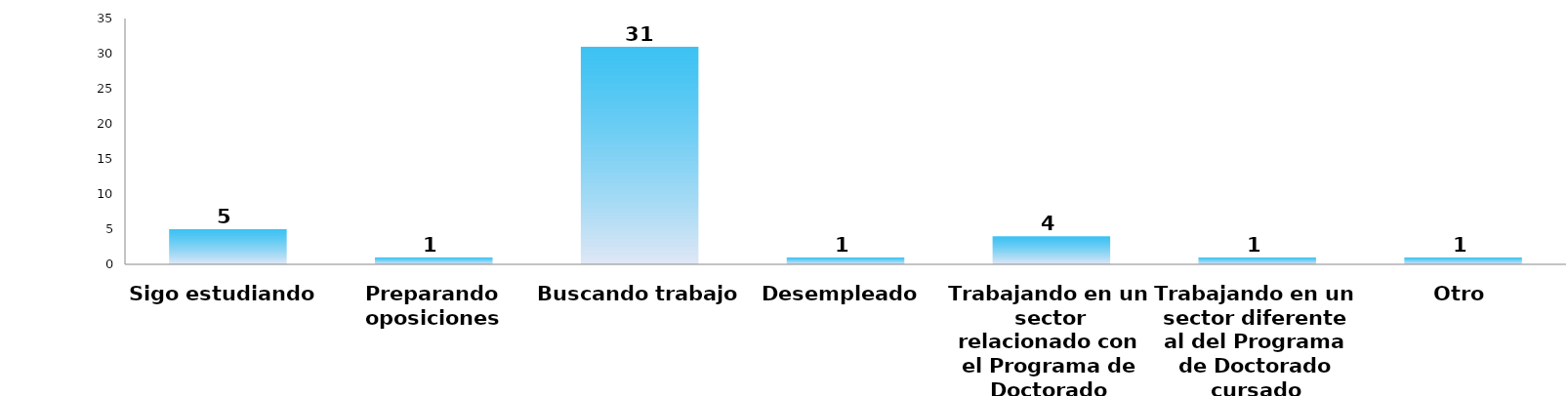
| Category | Series 0 |
|---|---|
| Sigo estudiando | 5 |
| Preparando oposiciones | 1 |
| Buscando trabajo | 31 |
| Desempleado | 1 |
| Trabajando en un sector relacionado con el Programa de Doctorado cursado | 4 |
| Trabajando en un sector diferente al del Programa de Doctorado cursado | 1 |
| Otro | 1 |